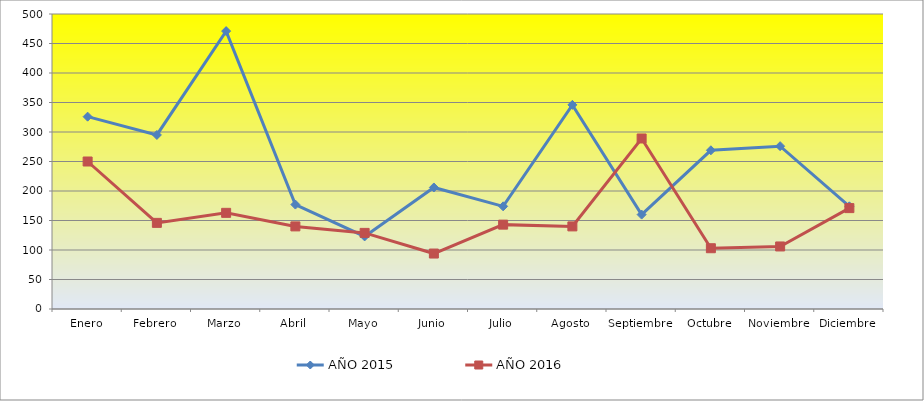
| Category | AÑO 2015 | AÑO 2016 |
|---|---|---|
| Enero | 326 | 250 |
| Febrero | 295 | 146 |
| Marzo | 471 | 163 |
| Abril | 177 | 140 |
| Mayo | 123 | 129 |
| Junio | 206 | 94 |
| Julio | 174 | 143 |
| Agosto | 346 | 140 |
| Septiembre | 160 | 289 |
| Octubre | 269 | 103 |
| Noviembre | 276 | 106 |
| Diciembre | 174 | 171 |